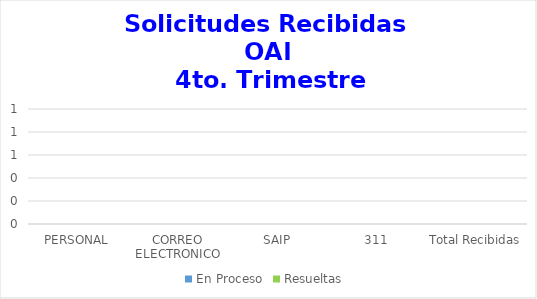
| Category | En Proceso | Resueltas  |
|---|---|---|
| PERSONAL | 0 | 0 |
| CORREO ELECTRONICO | 0 | 0 |
| SAIP | 0 | 0 |
| 311 | 0 | 0 |
| Total Recibidas | 0 | 0 |